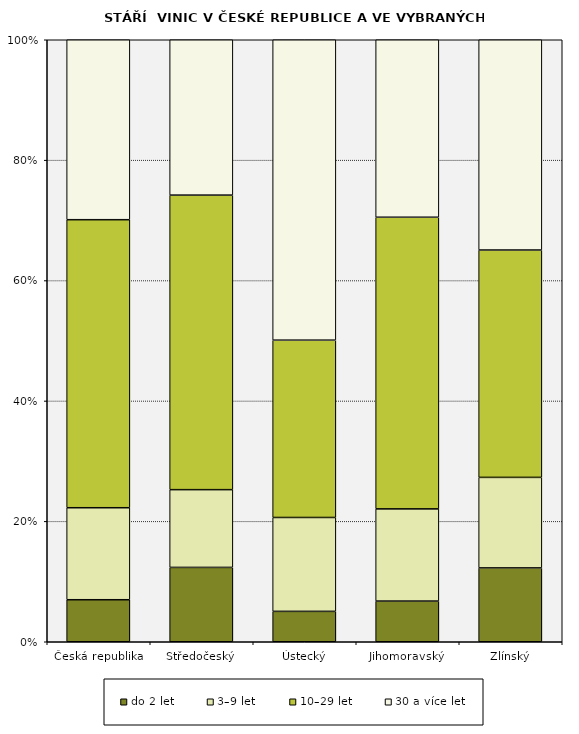
| Category | do 2 let | 3–9 let | 10–29 let | 30 a více let |
|---|---|---|---|---|
| Česká republika | 1263.416 | 2766.041 | 8659.844 | 5410.064 |
| Středočeský | 40.973 | 42.852 | 162.329 | 85.612 |
| Ústecký | 16.398 | 50.648 | 95.681 | 162.076 |
| Jihomoravský | 1145.864 | 2597.247 | 8215.108 | 4999.104 |
| Zlínský | 56.344 | 69.057 | 173.468 | 160.404 |